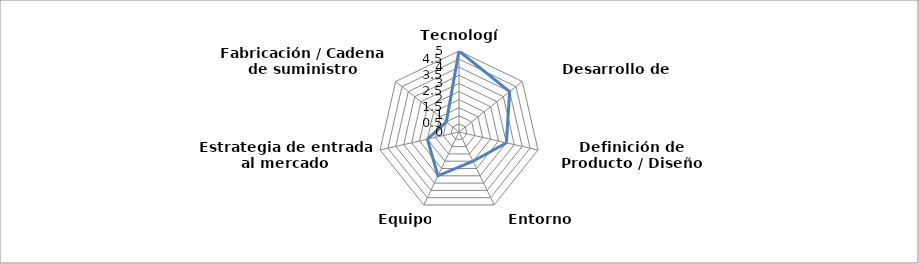
| Category | Series 0 |
|---|---|
| Tecnología | 5 |
| Desarrollo de productos | 4 |
| Definición de Producto / Diseño | 3 |
| Entorno competitivo | 2 |
| Equipo | 3 |
| Estrategia de entrada al mercado | 2 |
| Fabricación / Cadena de suministro | 1 |